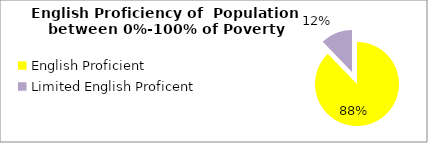
| Category | Percent |
|---|---|
| English Proficient | 0.877 |
| Limited English Proficent | 0.123 |